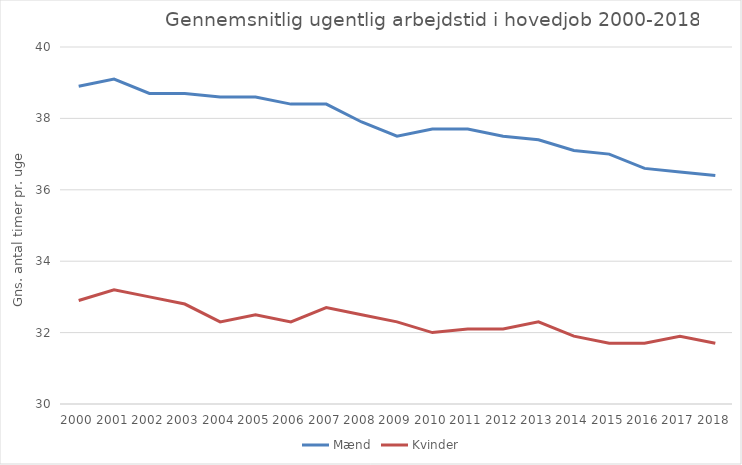
| Category | Mænd | Kvinder |
|---|---|---|
| 2000 | 38.9 | 32.9 |
| 2001 | 39.1 | 33.2 |
| 2002 | 38.7 | 33 |
| 2003 | 38.7 | 32.8 |
| 2004 | 38.6 | 32.3 |
| 2005 | 38.6 | 32.5 |
| 2006 | 38.4 | 32.3 |
| 2007 | 38.4 | 32.7 |
| 2008 | 37.9 | 32.5 |
| 2009 | 37.5 | 32.3 |
| 2010 | 37.7 | 32 |
| 2011 | 37.7 | 32.1 |
| 2012 | 37.5 | 32.1 |
| 2013 | 37.4 | 32.3 |
| 2014 | 37.1 | 31.9 |
| 2015 | 37 | 31.7 |
| 2016 | 36.6 | 31.7 |
| 2017 | 36.5 | 31.9 |
| 2018 | 36.4 | 31.7 |